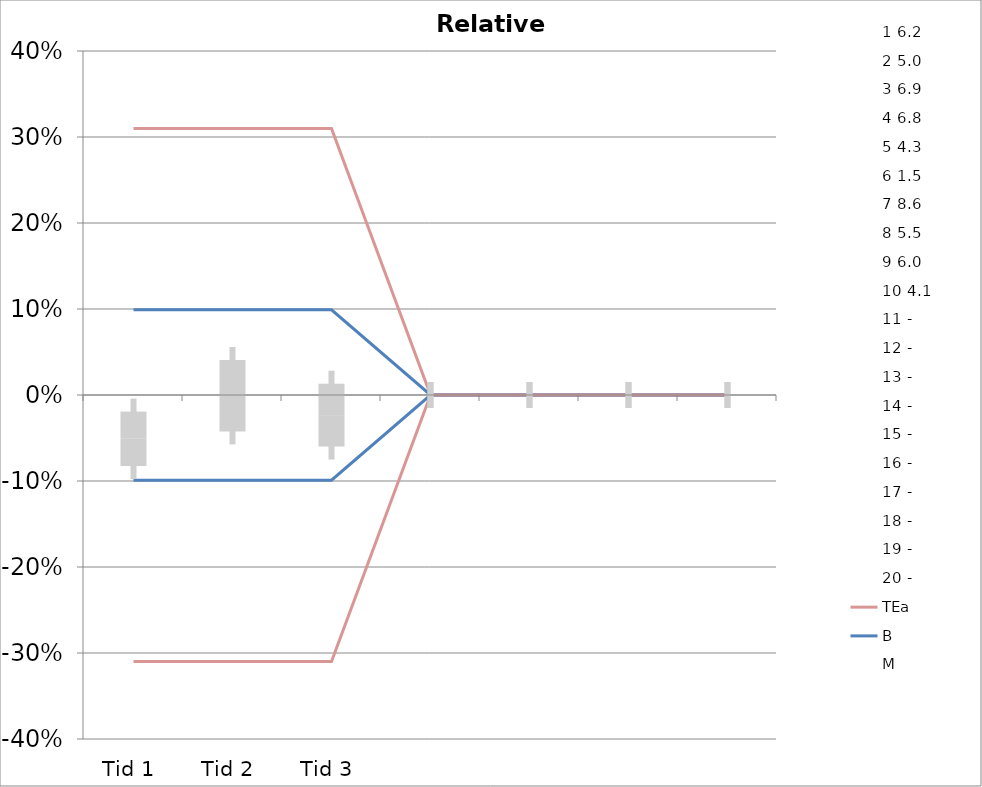
| Category | 1 | 2 | 3 | 4 | 5 | 6 | 7 | 8 | 9 | 10 | 11 | 12 | 13 | 14 | 15 | 16 | 17 | 18 | 19 | 20 | TEa | B | -B | -TEa | M |
|---|---|---|---|---|---|---|---|---|---|---|---|---|---|---|---|---|---|---|---|---|---|---|---|---|---|
| Tid 1 | -0.018 | -0.016 | -0.114 | -0.087 | -0.076 | -0.007 | -0.065 | -0.109 | -0.017 | 0 | 0 | 0 | 0 | 0 | 0 | 0 | 0 | 0 | 0 | 0 | 0.31 | 0.099 | -0.099 | -0.31 | -0.051 |
| Tid 2 | -0.06 | -0.018 | -0.058 | -0.024 | -0.055 | 0.088 | 0.042 | -0.036 | 0.023 | 0.09 | 0 | 0 | 0 | 0 | 0 | 0 | 0 | 0 | 0 | 0 | 0.31 | 0.099 | -0.099 | -0.31 | -0.001 |
| Tid 3 | -0.109 | 0.002 | -0.101 | -0.009 | -0.055 | 0.02 | 0.053 | -0.018 | -0.01 | -0.007 | 0 | 0 | 0 | 0 | 0 | 0 | 0 | 0 | 0 | 0 | 0.31 | 0.099 | -0.099 | -0.31 | -0.023 |